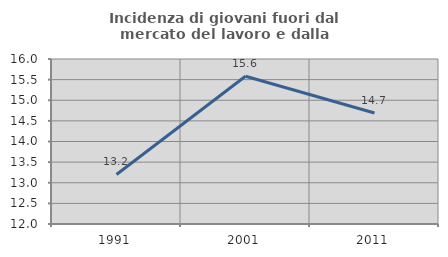
| Category | Incidenza di giovani fuori dal mercato del lavoro e dalla formazione  |
|---|---|
| 1991.0 | 13.201 |
| 2001.0 | 15.581 |
| 2011.0 | 14.69 |